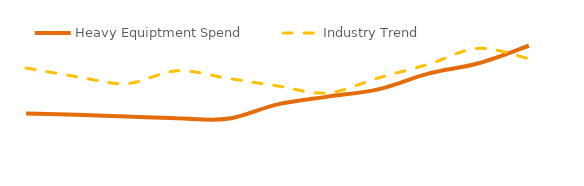
| Category | Heavy Equiptment Spend | Industry Trend |
|---|---|---|
| 0 | 449.217 | 853.513 |
| 1 | 437.143 | 776.697 |
| 2 | 421.233 | 714.561 |
| 3 | 407.236 | 828.891 |
| 4 | 401.351 | 762.58 |
| 5 | 529.921 | 693.947 |
| 6 | 599.003 | 631.492 |
| 7 | 663.501 | 764.106 |
| 8 | 802.915 | 886.362 |
| 9 | 895.433 | 1028.18 |
| 10 | 1051.117 | 935.644 |